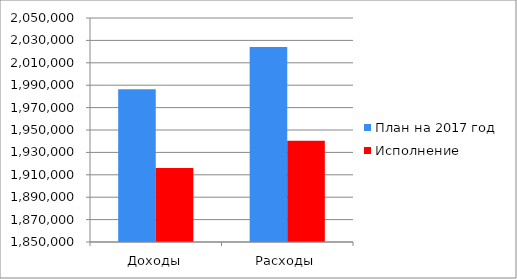
| Category | План на 2017 год | Исполнение |
|---|---|---|
| Доходы | 1986380 | 1916013.7 |
| Расходы | 2024208.5 | 1940312.9 |